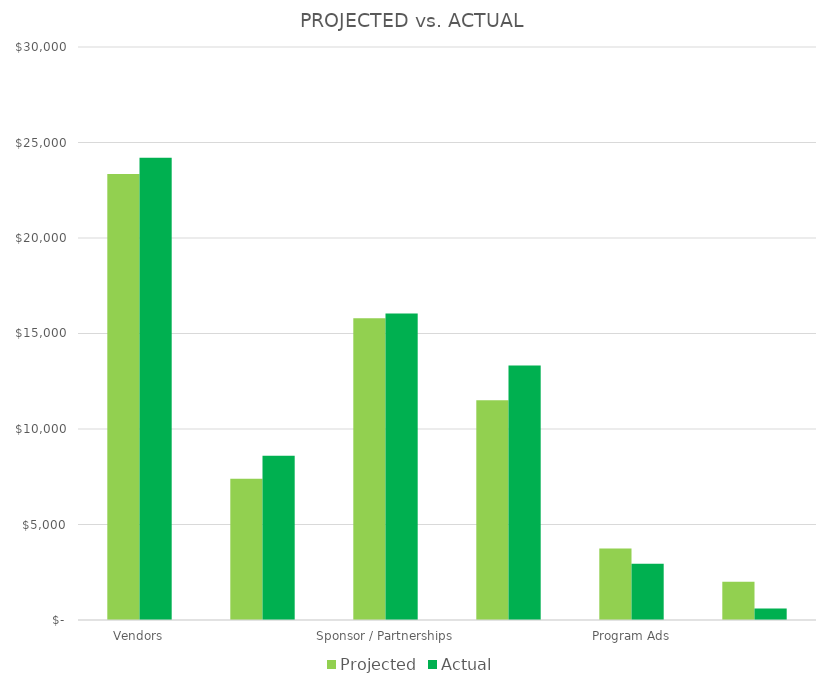
| Category | Projected | Actual |
|---|---|---|
| Vendors | 23350 | 24200 |
| Sponsor / Partnerships | 7400 | 8600 |
| Program Ads | 15800 | 16050 |
| Ticket Sales | 11500 | 13325 |
| Product Sales | 3750 | 2950 |
| Other | 2000 | 600 |